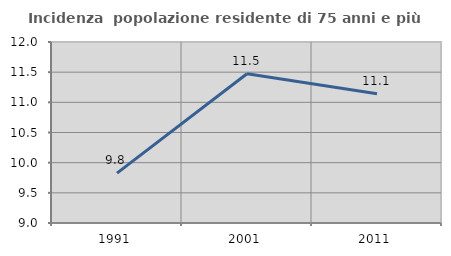
| Category | Incidenza  popolazione residente di 75 anni e più |
|---|---|
| 1991.0 | 9.827 |
| 2001.0 | 11.473 |
| 2011.0 | 11.142 |